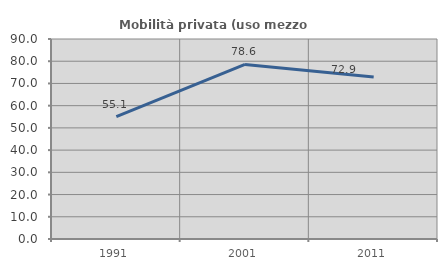
| Category | Mobilità privata (uso mezzo privato) |
|---|---|
| 1991.0 | 55.102 |
| 2001.0 | 78.571 |
| 2011.0 | 72.941 |